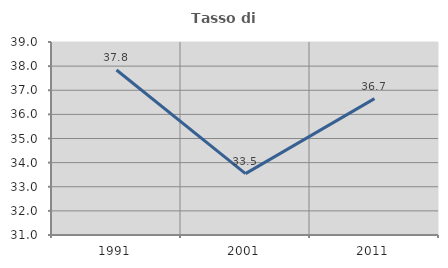
| Category | Tasso di occupazione   |
|---|---|
| 1991.0 | 37.841 |
| 2001.0 | 33.543 |
| 2011.0 | 36.653 |